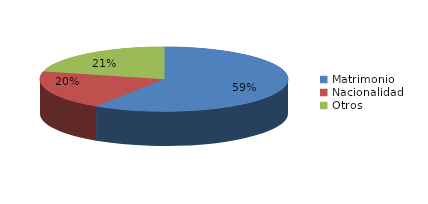
| Category | Series 0 |
|---|---|
| Matrimonio | 3953 |
| Nacionalidad | 1313 |
| Otros | 1414 |